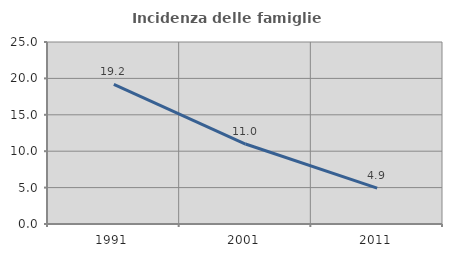
| Category | Incidenza delle famiglie numerose |
|---|---|
| 1991.0 | 19.182 |
| 2001.0 | 10.987 |
| 2011.0 | 4.924 |